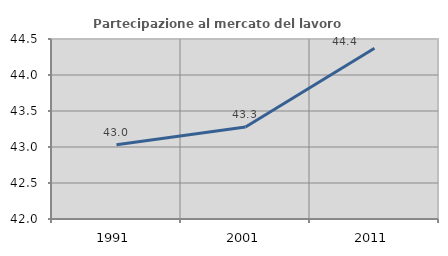
| Category | Partecipazione al mercato del lavoro  femminile |
|---|---|
| 1991.0 | 43.032 |
| 2001.0 | 43.279 |
| 2011.0 | 44.37 |